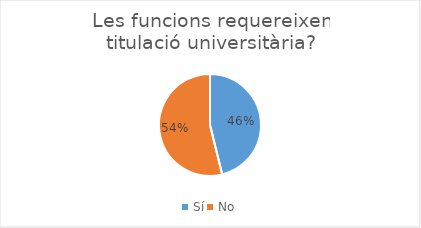
| Category | Series 0 |
|---|---|
| Sí | 6 |
| No | 7 |